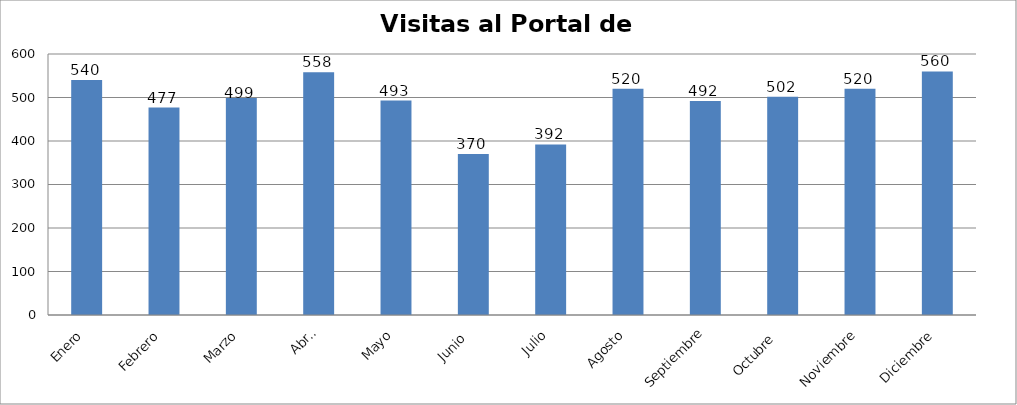
| Category | Series 0 |
|---|---|
| Enero | 540 |
| Febrero | 477 |
| Marzo | 499 |
| Abril | 558 |
| Mayo | 493 |
| Junio  | 370 |
| Julio | 392 |
| Agosto | 520 |
| Septiembre | 492 |
| Octubre  | 502 |
| Noviembre | 520 |
| Diciembre | 560 |